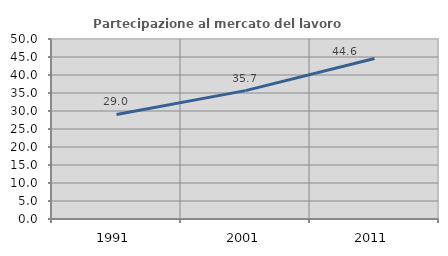
| Category | Partecipazione al mercato del lavoro  femminile |
|---|---|
| 1991.0 | 29.034 |
| 2001.0 | 35.657 |
| 2011.0 | 44.59 |